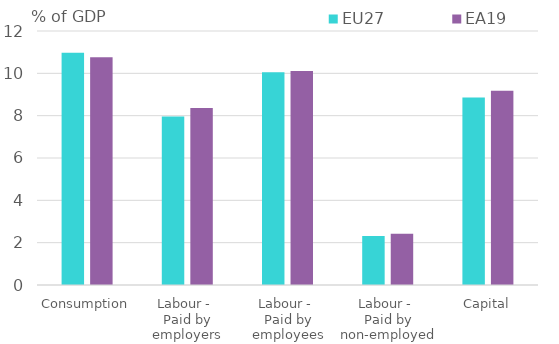
| Category | EU27 | EA19 |
|---|---|---|
| Consumption | 10.967 | 10.761 |
| Labour - 
Paid by employers | 7.966 | 8.36 |
| Labour - 
Paid by employees | 10.052 | 10.113 |
| Labour - 
Paid by non-employed | 2.311 | 2.42 |
| Capital | 8.858 | 9.18 |